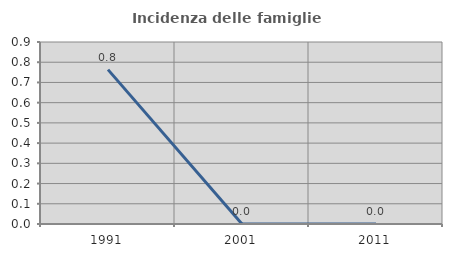
| Category | Incidenza delle famiglie numerose |
|---|---|
| 1991.0 | 0.763 |
| 2001.0 | 0 |
| 2011.0 | 0 |